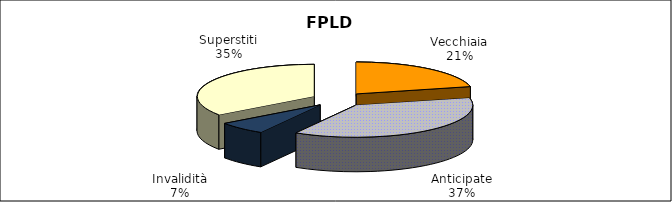
| Category | Series 0 |
|---|---|
| Vecchiaia | 52998 |
| Anticipate | 92449 |
| Invalidità | 16620 |
| Superstiti | 86696 |